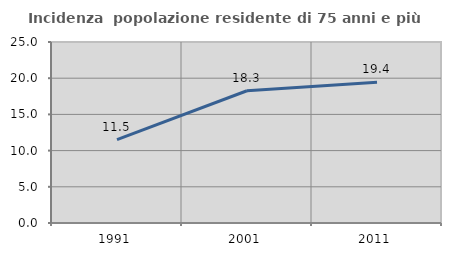
| Category | Incidenza  popolazione residente di 75 anni e più |
|---|---|
| 1991.0 | 11.515 |
| 2001.0 | 18.269 |
| 2011.0 | 19.444 |